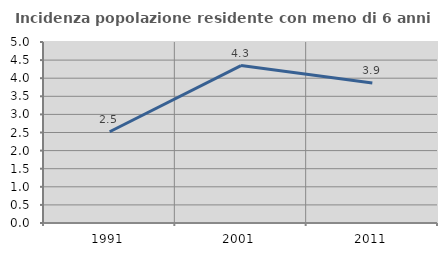
| Category | Incidenza popolazione residente con meno di 6 anni |
|---|---|
| 1991.0 | 2.521 |
| 2001.0 | 4.348 |
| 2011.0 | 3.865 |